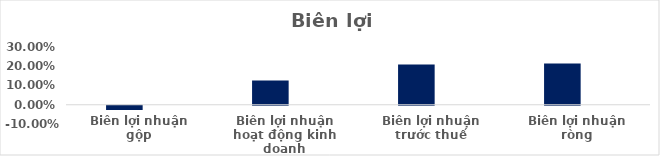
| Category | Series 0 | Series 1 | Series 2 | Series 3 | Series 4 |
|---|---|---|---|---|---|
| Biên lợi nhuận gộp | -0.022 |  |  |  |  |
| Biên lợi nhuận hoạt động kinh doanh | 0.126 |  |  |  |  |
| Biên lợi nhuận trước thuế | 0.209 |  |  |  |  |
| Biên lợi nhuận ròng | 0.214 |  |  |  |  |